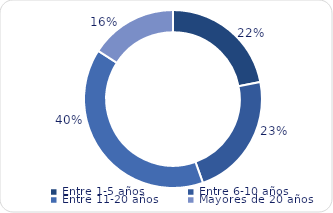
| Category | Series 0 |
|---|---|
| Entre 1-5 años | 3226.5 |
| Entre 6-10 años | 3327.2 |
| Entre 11-20 años | 5819.3 |
| Mayores de 20 años | 2338.2 |